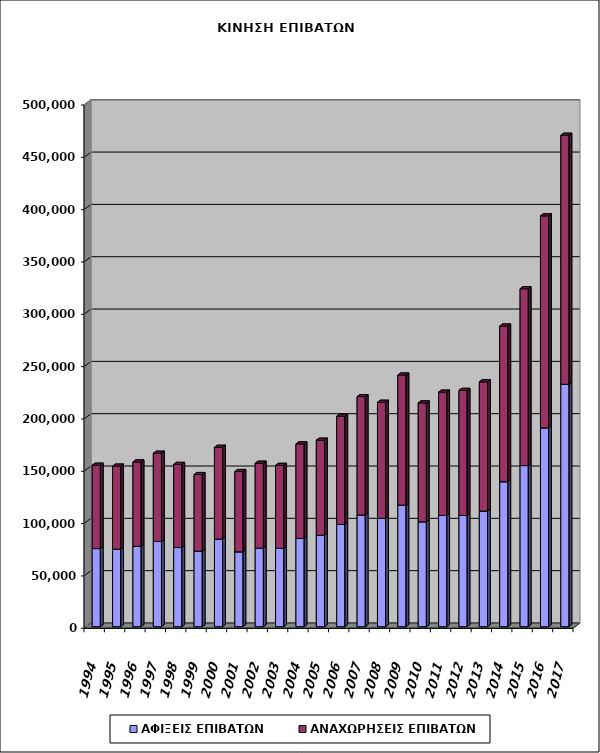
| Category | ΑΦΙΞΕΙΣ ΕΠΙΒΑΤΩΝ | ΑΝΑΧΩΡΗΣΕΙΣ ΕΠΙΒΑΤΩΝ |
|---|---|---|
| 1994.0 | 74650 | 79638 |
| 1995.0 | 74022 | 79395 |
| 1996.0 | 76857 | 80568 |
| 1997.0 | 81386 | 84333 |
| 1998.0 | 75623 | 79399 |
| 1999.0 | 72171 | 73191 |
| 2000.0 | 83700 | 87707 |
| 2001.0 | 71545 | 76712 |
| 2002.0 | 74957 | 81220 |
| 2003.0 | 74913 | 79203 |
| 2004.0 | 84291 | 90341 |
| 2005.0 | 87342 | 90856 |
| 2006.0 | 97677 | 103436 |
| 2007.0 | 106690 | 113170 |
| 2008.0 | 103580 | 110856 |
| 2009.0 | 116092 | 124369 |
| 2010.0 | 100219 | 113633 |
| 2011.0 | 106295 | 117830 |
| 2012.0 | 106254 | 119535 |
| 2013.0 | 110430 | 123519 |
| 2014.0 | 138529 | 148736 |
| 2015.0 | 153963 | 168938 |
| 2016.0 | 189963 | 202562 |
| 2017.0 | 231635 | 237961 |